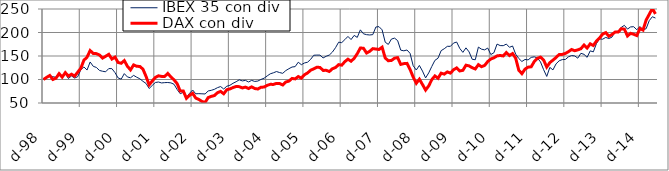
| Category | IBEX 35 con div | DAX con div |
|---|---|---|
| 1998-12-01 | 100 | 100 |
| 1999-01-01 | 105.619 | 104.615 |
| 1999-02-01 | 107.53 | 108.555 |
| 1999-03-01 | 105.845 | 100.054 |
| 1999-04-01 | 104.802 | 102.778 |
| 1999-05-01 | 108.782 | 112.461 |
| 1999-06-01 | 108.43 | 105.009 |
| 1999-07-01 | 112.399 | 114.607 |
| 1999-08-01 | 102.07 | 107.273 |
| 1999-09-01 | 107.538 | 111.197 |
| 1999-10-01 | 103.027 | 107.169 |
| 1999-11-01 | 105.958 | 115.542 |
| 1999-12-01 | 120.689 | 124.094 |
| 2000-01-01 | 126.708 | 141.178 |
| 2000-02-01 | 120.089 | 147.446 |
| 2000-03-01 | 137.269 | 161.614 |
| 2000-04-01 | 128.004 | 155.367 |
| 2000-05-01 | 125.684 | 155.063 |
| 2000-06-01 | 119.301 | 152.095 |
| 2000-07-01 | 117.522 | 145.532 |
| 2000-08-01 | 116.431 | 149.434 |
| 2000-09-01 | 123.287 | 153.599 |
| 2000-10-01 | 123.12 | 143.51 |
| 2000-11-01 | 114.632 | 147.626 |
| 2000-12-01 | 103.315 | 136.204 |
| 2001-01-01 | 100.78 | 134.546 |
| 2001-02-01 | 112.512 | 140.215 |
| 2001-03-01 | 105.433 | 128.058 |
| 2001-04-01 | 103.641 | 120.474 |
| 2001-05-01 | 108.766 | 131.009 |
| 2001-06-01 | 104.829 | 128.095 |
| 2001-07-01 | 101.547 | 127.768 |
| 2001-08-01 | 96.16 | 122.032 |
| 2001-09-01 | 91.617 | 106.533 |
| 2001-10-01 | 80.853 | 88.67 |
| 2001-11-01 | 87.42 | 96.955 |
| 2001-12-01 | 93.609 | 104.323 |
| 2002-01-01 | 94.676 | 107.913 |
| 2002-02-01 | 92.684 | 106.594 |
| 2002-03-01 | 93.367 | 106.602 |
| 2002-04-01 | 93.61 | 112.873 |
| 2002-05-01 | 92.809 | 105.426 |
| 2002-06-01 | 89.925 | 99.294 |
| 2002-07-01 | 78.838 | 91.323 |
| 2002-08-01 | 69.733 | 75.421 |
| 2002-09-01 | 72.792 | 75.483 |
| 2002-10-01 | 61.651 | 59.92 |
| 2002-11-01 | 70.642 | 66.193 |
| 2002-12-01 | 77.645 | 70.69 |
| 2003-01-01 | 69.584 | 60.493 |
| 2003-02-01 | 69.901 | 57.552 |
| 2003-03-01 | 69.553 | 53.321 |
| 2003-04-01 | 69.215 | 51.241 |
| 2003-05-01 | 75.584 | 61.527 |
| 2003-06-01 | 76.962 | 64.089 |
| 2003-07-01 | 79.064 | 65.804 |
| 2003-08-01 | 82.653 | 71.917 |
| 2003-09-01 | 85.004 | 74.685 |
| 2003-10-01 | 79.795 | 69.637 |
| 2003-11-01 | 85.725 | 78.308 |
| 2003-12-01 | 87.643 | 79.913 |
| 2004-01-01 | 91.981 | 82.923 |
| 2004-02-01 | 95.269 | 85.149 |
| 2004-03-01 | 99.36 | 84.79 |
| 2004-04-01 | 97.007 | 82.08 |
| 2004-05-01 | 98.157 | 83.812 |
| 2004-06-01 | 94.714 | 80.811 |
| 2004-07-01 | 98.166 | 84.384 |
| 2004-08-01 | 95.861 | 80.781 |
| 2004-09-01 | 96.713 | 79.838 |
| 2004-10-01 | 100.145 | 83.546 |
| 2004-11-01 | 102.748 | 83.916 |
| 2004-12-01 | 107.616 | 87.542 |
| 2005-01-01 | 112.125 | 89.748 |
| 2005-02-01 | 114.286 | 89.507 |
| 2005-03-01 | 116.944 | 91.674 |
| 2005-04-01 | 114.736 | 91.463 |
| 2005-05-01 | 113.152 | 88.337 |
| 2005-06-01 | 118.983 | 94.676 |
| 2005-07-01 | 122.995 | 96.556 |
| 2005-08-01 | 126.56 | 102.282 |
| 2005-09-01 | 127.379 | 101.28 |
| 2005-10-01 | 136.788 | 106.281 |
| 2005-11-01 | 131.493 | 102.945 |
| 2005-12-01 | 135.167 | 110.139 |
| 2006-01-01 | 136.798 | 113.975 |
| 2006-02-01 | 142.946 | 119.759 |
| 2006-03-01 | 151.622 | 122.688 |
| 2006-04-01 | 151.904 | 125.981 |
| 2006-05-01 | 151.865 | 125.684 |
| 2006-06-01 | 145.918 | 119.362 |
| 2006-07-01 | 149.46 | 119.469 |
| 2006-08-01 | 152.007 | 117.044 |
| 2006-09-01 | 158.324 | 122.896 |
| 2006-10-01 | 167.71 | 125.466 |
| 2006-11-01 | 179.362 | 131.582 |
| 2006-12-01 | 178.49 | 130.52 |
| 2007-01-01 | 184.837 | 137.961 |
| 2007-02-01 | 191.637 | 143.28 |
| 2007-03-01 | 184.975 | 138.867 |
| 2007-04-01 | 193.83 | 145.077 |
| 2007-05-01 | 189.541 | 154.941 |
| 2007-06-01 | 205.621 | 167.049 |
| 2007-07-01 | 197.221 | 166.43 |
| 2007-08-01 | 195.393 | 156.302 |
| 2007-09-01 | 194.74 | 159.954 |
| 2007-10-01 | 195.491 | 165.681 |
| 2007-11-01 | 211.728 | 164.812 |
| 2007-12-01 | 212.42 | 163.9 |
| 2008-01-01 | 205.631 | 168.711 |
| 2008-02-01 | 179.319 | 145.735 |
| 2008-03-01 | 174.66 | 139.906 |
| 2008-04-01 | 186.02 | 140.542 |
| 2008-05-01 | 188.015 | 145.32 |
| 2008-06-01 | 182.77 | 146.574 |
| 2008-07-01 | 162.448 | 132.085 |
| 2008-08-01 | 161.02 | 133.769 |
| 2008-09-01 | 162.791 | 134.299 |
| 2008-10-01 | 155.673 | 121.427 |
| 2008-11-01 | 129.289 | 105.126 |
| 2008-12-01 | 120.165 | 91.908 |
| 2009-01-01 | 129.94 | 100.595 |
| 2009-02-01 | 117.895 | 89.32 |
| 2009-03-01 | 103.376 | 77.588 |
| 2009-04-01 | 114.031 | 86.393 |
| 2009-05-01 | 127.789 | 99.743 |
| 2009-06-01 | 140.743 | 107.546 |
| 2009-07-01 | 145.305 | 102.587 |
| 2009-08-01 | 161.374 | 113.491 |
| 2009-09-01 | 165.442 | 111.409 |
| 2009-10-01 | 170.569 | 116.162 |
| 2009-11-01 | 170.592 | 113.574 |
| 2009-12-01 | 177.59 | 120.806 |
| 2010-01-01 | 179.673 | 124.587 |
| 2010-02-01 | 166.17 | 118.252 |
| 2010-03-01 | 157.718 | 119.486 |
| 2010-04-01 | 167.303 | 130.404 |
| 2010-05-01 | 158.772 | 128.968 |
| 2010-06-01 | 143.047 | 125.086 |
| 2010-07-01 | 142.001 | 122.496 |
| 2010-08-01 | 168.975 | 131.587 |
| 2010-09-01 | 164.498 | 127.232 |
| 2010-10-01 | 163.043 | 129.897 |
| 2010-11-01 | 166.885 | 138.127 |
| 2010-12-01 | 153.113 | 143.601 |
| 2011-01-01 | 156.979 | 146.176 |
| 2011-02-01 | 175.347 | 150.244 |
| 2011-03-01 | 172.204 | 151.06 |
| 2011-04-01 | 171.973 | 150.151 |
| 2011-05-01 | 175.392 | 157.425 |
| 2011-06-01 | 168.493 | 150.938 |
| 2011-07-01 | 171.291 | 155.162 |
| 2011-08-01 | 153.914 | 145.428 |
| 2011-09-01 | 144.729 | 119.844 |
| 2011-10-01 | 138.328 | 112.443 |
| 2011-11-01 | 142.632 | 122.017 |
| 2011-12-01 | 141.728 | 126.228 |
| 2012-01-01 | 147.021 | 127.057 |
| 2012-02-01 | 148.205 | 138.373 |
| 2012-03-01 | 145.784 | 145.173 |
| 2012-04-01 | 137.243 | 147.575 |
| 2012-05-01 | 120.851 | 141.396 |
| 2012-06-01 | 106.541 | 126.529 |
| 2012-07-01 | 125.76 | 135.852 |
| 2012-08-01 | 120.424 | 141.256 |
| 2012-09-01 | 133.24 | 146.701 |
| 2012-10-01 | 139.818 | 153.223 |
| 2012-11-01 | 142.335 | 153.41 |
| 2012-12-01 | 142.626 | 155.492 |
| 2013-01-01 | 148.337 | 159.197 |
| 2013-02-01 | 150.968 | 163.819 |
| 2013-03-01 | 150.185 | 161.2 |
| 2013-04-01 | 145.357 | 163.023 |
| 2013-05-01 | 155.721 | 165.499 |
| 2013-06-01 | 153.542 | 173.28 |
| 2013-07-01 | 147.159 | 166.967 |
| 2013-08-01 | 160.907 | 175.893 |
| 2013-09-01 | 158.822 | 172.404 |
| 2013-10-01 | 176.327 | 181.715 |
| 2013-11-01 | 186.487 | 188.38 |
| 2013-12-01 | 185.731 | 196.623 |
| 2014-01-01 | 189.502 | 199.764 |
| 2014-02-01 | 187.16 | 192.117 |
| 2014-03-01 | 190.11 | 195.722 |
| 2014-04-01 | 201.896 | 200.842 |
| 2014-05-01 | 202.723 | 200.832 |
| 2014-06-01 | 210.978 | 208.086 |
| 2014-07-01 | 215.197 | 207.088 |
| 2014-08-01 | 207.304 | 192.61 |
| 2014-09-01 | 211.897 | 198.234 |
| 2014-10-01 | 212.328 | 196.206 |
| 2014-11-01 | 205.802 | 193.48 |
| 2014-12-01 | 212.708 | 208.366 |
| 2015-01-01 | 205.832 | 205.063 |
| 2015-02-01 | 208.072 | 226.445 |
| 2015-03-01 | 225.204 | 238.624 |
| 2015-04-01 | 233.52 | 250.984 |
| 2015-05-01 | 230.797 | 239.545 |